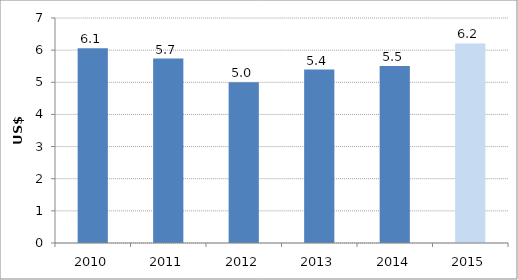
| Category | US$ billions |
|---|---|
| 2010.0 | 6.059 |
| 2011.0 | 5.738 |
| 2012.0 | 4.998 |
| 2013.0 | 5.398 |
| 2014.0 | 5.508 |
| 2015.0 | 6.208 |